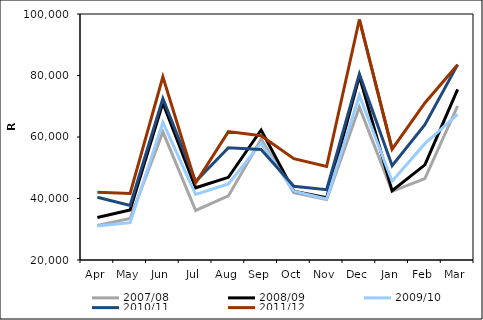
| Category | 2006/07 | 2007/08 | 2008/09 | 2009/10 | 2010/11 | 2011/12 |
|---|---|---|---|---|---|---|
| Apr |  | 31225.641 | 33809.564 | 31083.395 | 40406.963 | 41994.179 |
| May |  | 33481.402 | 36233 | 32136.098 | 37749.308 | 41636.929 |
| Jun |  | 61663.726 | 71110.044 | 64792.835 | 72529.412 | 79589.655 |
| Jul |  | 36127.85 | 43485.256 | 41300.399 | 45543.688 | 45062.32 |
| Aug |  | 40841.386 | 46880.927 | 44767.626 | 56485.269 | 61750.104 |
| Sep |  | 59283.308 | 62270.151 | 58023.573 | 55915.487 | 60434.852 |
| Oct |  | 41921.543 | 42369.938 | 42360.084 | 43979.153 | 52963.435 |
| Nov |  | 39679.105 | 40280.926 | 39864.285 | 42854.605 | 50411.655 |
| Dec |  | 69716.789 | 79692.266 | 73520.213 | 80516.23 | 98209.737 |
| Jan |  | 42341.22 | 42507.831 | 45634.341 | 50636.089 | 56028.469 |
| Feb |  | 46451.696 | 50944.431 | 57838.712 | 64025.853 | 71078.938 |
| Mar |  | 70080.854 | 75515.83 | 67383.882 | 83541.088 | 83489.44 |